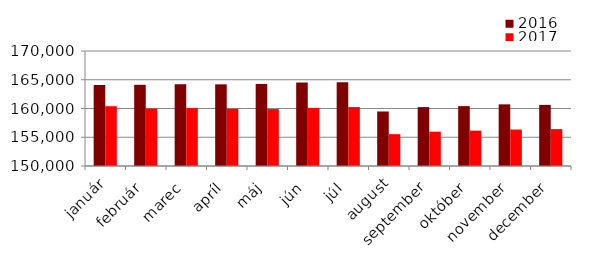
| Category | 2016 | 2017 |
|---|---|---|
| január | 164070 | 160397 |
| február | 164122 | 159990 |
| marec | 164218 | 160070 |
| apríl | 164199 | 159961 |
| máj | 164275 | 159902 |
| jún | 164519 | 160100 |
| júl | 164582 | 160248 |
| august | 159482 | 155536 |
| september | 160244 | 155970 |
| október | 160414 | 156155 |
| november | 160724 | 156340 |
| december | 160632 | 156416 |